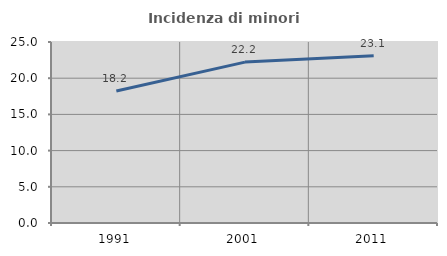
| Category | Incidenza di minori stranieri |
|---|---|
| 1991.0 | 18.229 |
| 2001.0 | 22.222 |
| 2011.0 | 23.084 |